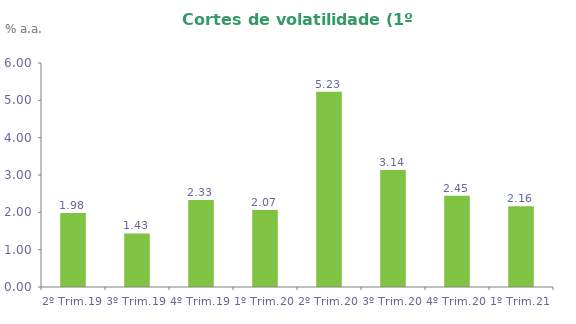
| Category | Series 0 |
|---|---|
| 2º Trim.19 | 1.98 |
| 3º Trim.19 | 1.435 |
| 4º Trim.19 | 2.33 |
| 1º Trim.20 | 2.065 |
| 2º Trim.20 | 5.231 |
| 3º Trim.20 | 3.137 |
| 4º Trim.20 | 2.447 |
| 1º Trim.21 | 2.162 |